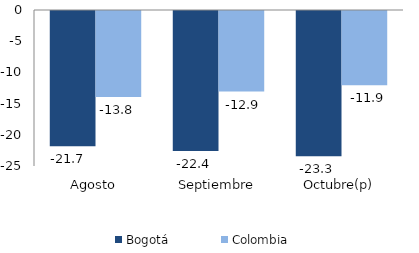
| Category | Bogotá | Colombia |
|---|---|---|
| Agosto | -21.664 | -13.773 |
| Septiembre | -22.44 | -12.92 |
| Octubre(p) | -23.288 | -11.907 |